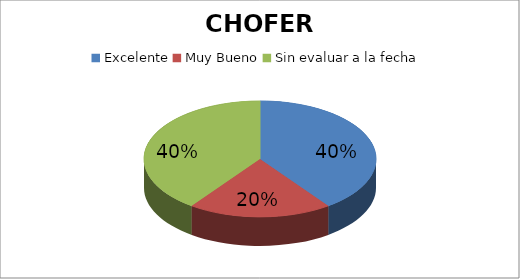
| Category | Cantidad |
|---|---|
| Excelente | 2 |
| Muy Bueno | 1 |
| Sin evaluar a la fecha | 2 |